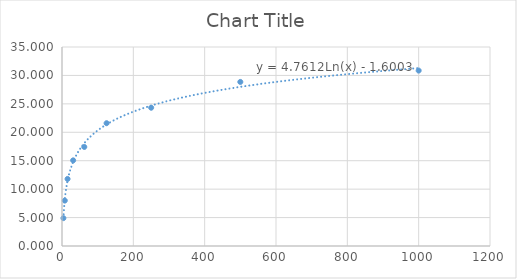
| Category | Series 0 |
|---|---|
| 3.91 | 4.9 |
| 7.81 | 7.985 |
| 15.62 | 11.797 |
| 31.25 | 15.064 |
| 62.5 | 17.423 |
| 125.0 | 21.597 |
| 250.0 | 24.319 |
| 500.0 | 28.857 |
| 1000.0 | 30.853 |